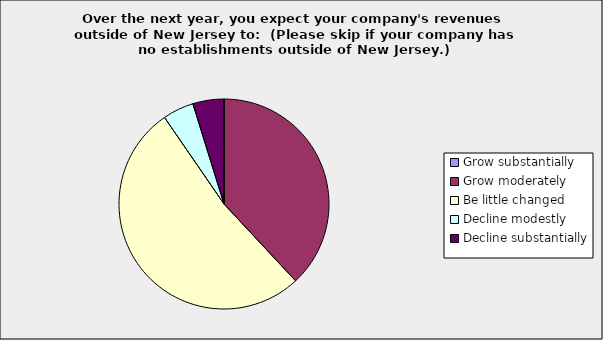
| Category | Series 0 |
|---|---|
| Grow substantially | 0 |
| Grow moderately | 0.381 |
| Be little changed | 0.524 |
| Decline modestly | 0.048 |
| Decline substantially | 0.048 |